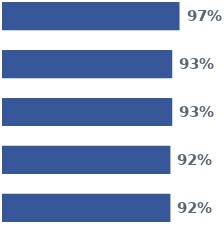
| Category | Series 0 | Series 1 | Series 2 | Series 3 | Series 4 |
|---|---|---|---|---|---|
| 0 | 0.97 | 0.93 | 0.93 | 0.92 | 0.92 |